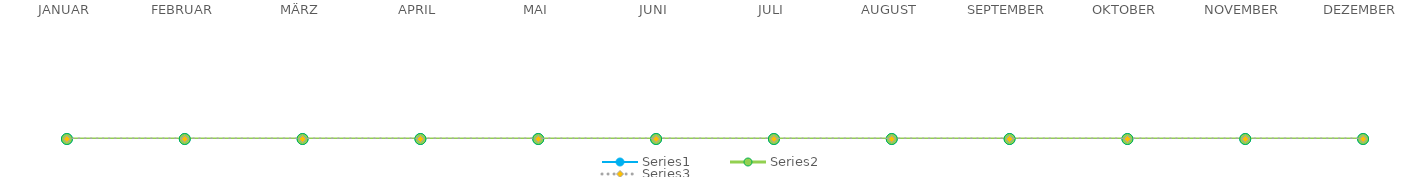
| Category | Series 0 | Series 1 | Series 2 |
|---|---|---|---|
| JANUAR | 0 | 0 | 0 |
| FEBRUAR | 0 | 0 | 0 |
| MÄRZ | 0 | 0 | 0 |
| APRIL | 0 | 0 | 0 |
| MAI | 0 | 0 | 0 |
| JUNI | 0 | 0 | 0 |
| JULI | 0 | 0 | 0 |
| AUGUST | 0 | 0 | 0 |
| SEPTEMBER | 0 | 0 | 0 |
| OKTOBER | 0 | 0 | 0 |
| NOVEMBER | 0 | 0 | 0 |
| DEZEMBER | 0 | 0 | 0 |